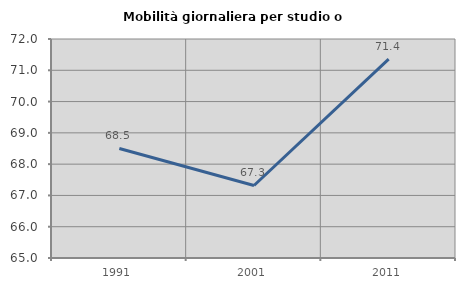
| Category | Mobilità giornaliera per studio o lavoro |
|---|---|
| 1991.0 | 68.5 |
| 2001.0 | 67.318 |
| 2011.0 | 71.357 |